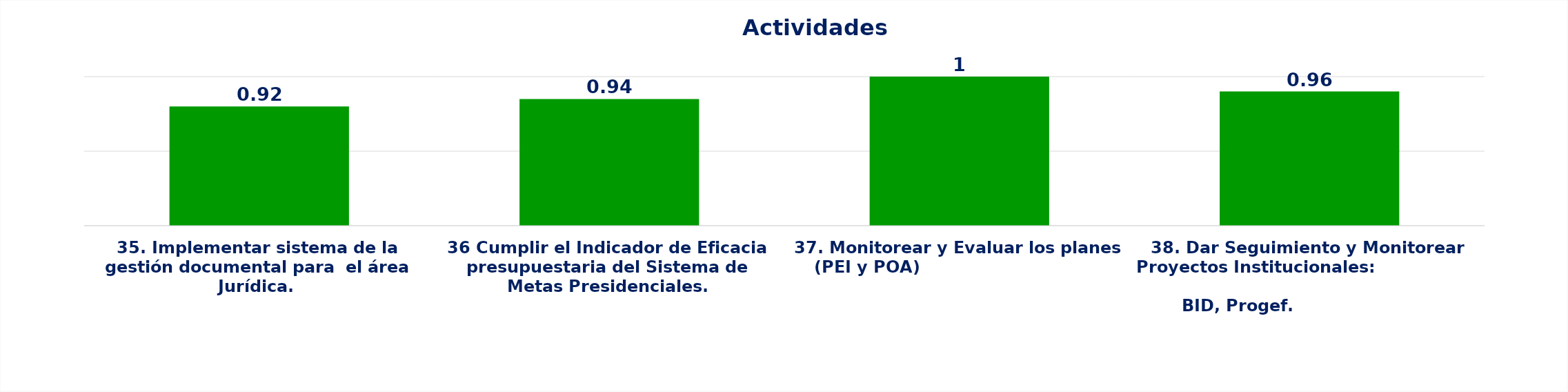
| Category | Series 0 |
|---|---|
| 35. Implementar sistema de la gestión documental para  el área Jurídica.  | 0.92 |
| 36 Cumplir el Indicador de Eficacia presupuestaria del Sistema de Metas Presidenciales. | 0.94 |
| 37. Monitorear y Evaluar los planes (PEI y POA)                                 | 1 |
| 38. Dar Seguimiento y Monitorear Proyectos Institucionales:                                                                                        BID, Progef.                                                                                                 | 0.96 |